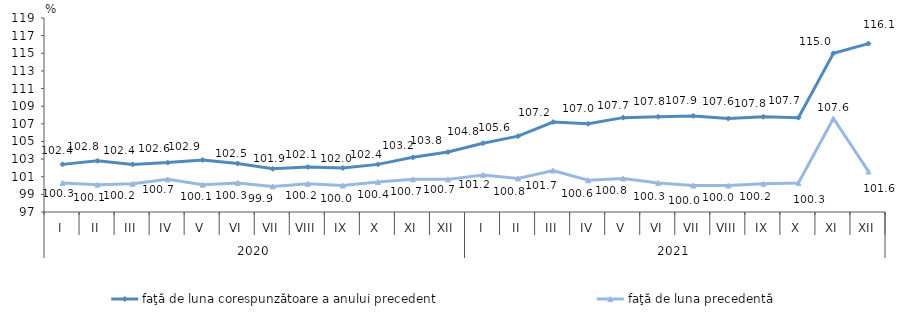
| Category | faţă de luna corespunzătoare a anului precedent | faţă de luna precedentă   |
|---|---|---|
| 0 | 102.4 | 100.3 |
| 1 | 102.8 | 100.1 |
| 2 | 102.4 | 100.2 |
| 3 | 102.6 | 100.7 |
| 4 | 102.9 | 100.1 |
| 5 | 102.5 | 100.3 |
| 6 | 101.9 | 99.9 |
| 7 | 102.1 | 100.2 |
| 8 | 102 | 100 |
| 9 | 102.4 | 100.4 |
| 10 | 103.2 | 100.7 |
| 11 | 103.8 | 100.7 |
| 12 | 104.8 | 101.2 |
| 13 | 105.6 | 100.8 |
| 14 | 107.2 | 101.7 |
| 15 | 107 | 100.6 |
| 16 | 107.7 | 100.8 |
| 17 | 107.8 | 100.3 |
| 18 | 107.9 | 100 |
| 19 | 107.6 | 100 |
| 20 | 107.8 | 100.2 |
| 21 | 107.7 | 100.3 |
| 22 | 115 | 107.6 |
| 23 | 116.1 | 101.6 |